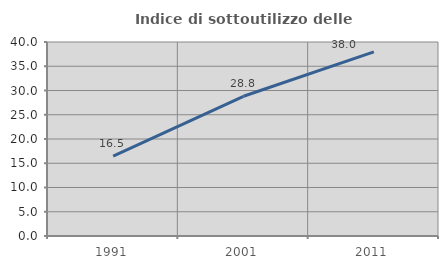
| Category | Indice di sottoutilizzo delle abitazioni  |
|---|---|
| 1991.0 | 16.46 |
| 2001.0 | 28.808 |
| 2011.0 | 37.959 |